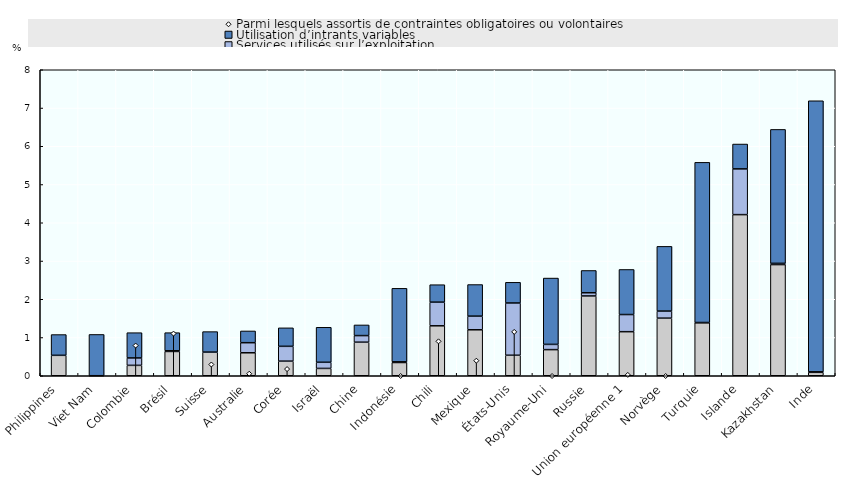
| Category | Formation de capital fixe | Services utilisés sur l’exploitation | Utilisation d’intrants variables |
|---|---|---|---|
| Philippines | 0.534 | 0 | 0.543 |
| Viet Nam | 0.001 | 0 | 1.079 |
| Colombie | 0.272 | 0.194 | 0.66 |
| Brésil | 0.635 | 0.018 | 0.473 |
| Suisse | 0.618 | 0 | 0.536 |
| Australie | 0.601 | 0.264 | 0.307 |
| Corée | 0.382 | 0.387 | 0.483 |
| Israël | 0.192 | 0.16 | 0.915 |
| Chine | 0.877 | 0.172 | 0.279 |
| Indonésie | 0.346 | 0.018 | 1.922 |
| Chili | 1.306 | 0.618 | 0.456 |
| Mexique | 1.202 | 0.357 | 0.826 |
| États-Unis | 0.536 | 1.366 | 0.541 |
| Royaume-Uni | 0.683 | 0.137 | 1.734 |
| Russie | 2.086 | 0.084 | 0.582 |
| Union européenne 1 | 1.152 | 0.448 | 1.179 |
| Norvège | 1.506 | 0.185 | 1.691 |
| Turquie | 1.386 | 0.006 | 4.188 |
| Islande | 4.213 | 1.196 | 0.65 |
| Kazakhstan | 2.906 | 0.032 | 3.502 |
| Inde | 0.089 | 0.014 | 7.087 |